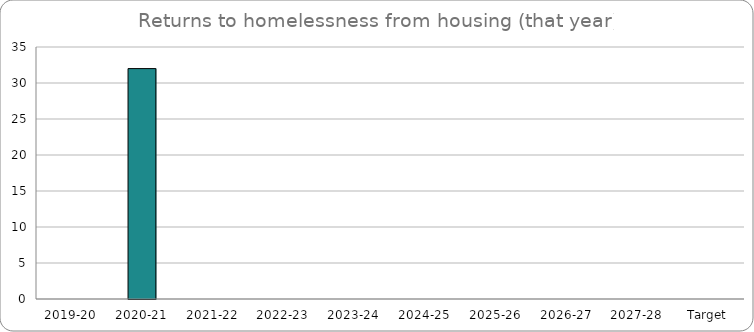
| Category | Series 0 |
|---|---|
| 2019-20 | 0 |
| 2020-21 | 32 |
| 2021-22 | 0 |
| 2022-23 | 0 |
| 2023-24 | 0 |
| 2024-25 | 0 |
| 2025-26 | 0 |
| 2026-27 | 0 |
| 2027-28 | 0 |
| Target | 0 |